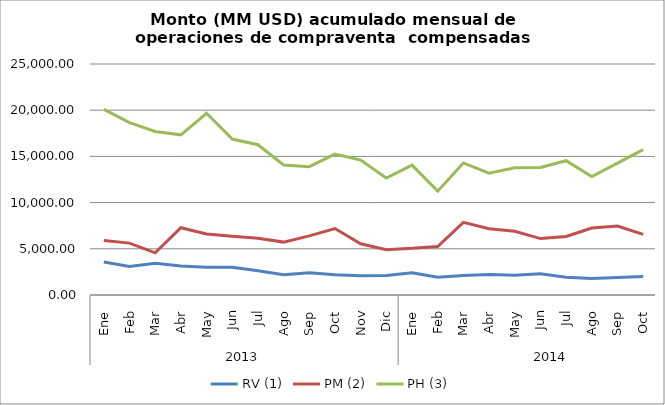
| Category | RV (1) | PM (2) | PH (3) |
|---|---|---|---|
| 0 | 3582.113 | 5901.651 | 20087.034 |
| 1 | 3086.223 | 5614.086 | 18662.914 |
| 2 | 3427.503 | 4559.027 | 17696.541 |
| 3 | 3146.302 | 7279.906 | 17332.385 |
| 4 | 2992.826 | 6596.857 | 19663.42 |
| 5 | 3012.804 | 6346.526 | 16878.408 |
| 6 | 2618.878 | 6139.885 | 16263.385 |
| 7 | 2182.732 | 5724.829 | 14069.305 |
| 8 | 2409.674 | 6399.577 | 13889.23 |
| 9 | 2180.079 | 7195.606 | 15254.774 |
| 10 | 2095.442 | 5541.836 | 14598.61 |
| 11 | 2104.88 | 4905.995 | 12657.524 |
| 12 | 2410.581 | 5047.1 | 14052.921 |
| 13 | 1913.3 | 5251.955 | 11240.27 |
| 14 | 2111.981 | 7861.413 | 14290.324 |
| 15 | 2223.473 | 7175.644 | 13176.799 |
| 16 | 2125.013 | 6892.343 | 13776.518 |
| 17 | 2301.328 | 6106.398 | 13805.87 |
| 18 | 1924.188 | 6332.088 | 14535.523 |
| 19 | 1793.449 | 7254.313 | 12809.829 |
| 20 | 1892.115 | 7460.432 | 14274.789 |
| 21 | 2010.501 | 6554.281 | 15737.718 |